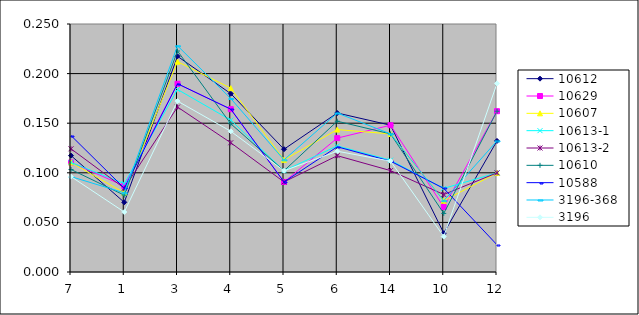
| Category | 10612 | 10629 | 10607 | 10613-1 | 10613-2 | 10610 | 10588 | 3196-368 | 3196 |
|---|---|---|---|---|---|---|---|---|---|
| 7.0 | 0.117 | 0.11 | 0.11 | 0.11 | 0.124 | 0.103 | 0.138 | 0.096 | 0.096 |
| 1.0 | 0.07 | 0.087 | 0.08 | 0.089 | 0.084 | 0.077 | 0.084 | 0.08 | 0.06 |
| 3.0 | 0.217 | 0.19 | 0.212 | 0.184 | 0.166 | 0.223 | 0.19 | 0.228 | 0.172 |
| 4.0 | 0.18 | 0.164 | 0.185 | 0.153 | 0.13 | 0.149 | 0.164 | 0.175 | 0.142 |
| 5.0 | 0.124 | 0.091 | 0.113 | 0.102 | 0.091 | 0.102 | 0.091 | 0.113 | 0.102 |
| 6.0 | 0.16 | 0.135 | 0.144 | 0.127 | 0.117 | 0.152 | 0.126 | 0.16 | 0.122 |
| 14.0 | 0.148 | 0.148 | 0.139 | 0.113 | 0.102 | 0.139 | 0.112 | 0.139 | 0.112 |
| 10.0 | 0.039 | 0.066 | 0.072 | 0.084 | 0.078 | 0.059 | 0.084 | 0.072 | 0.036 |
| 12.0 | 0.132 | 0.162 | 0.1 | 0.1 | 0.1 | 0.162 | 0.027 | 0.132 | 0.19 |